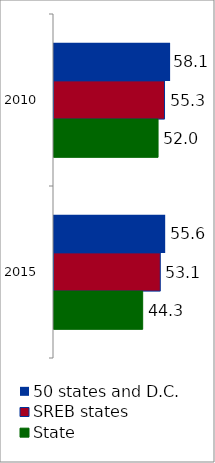
| Category | 50 states and D.C. | SREB states | State |
|---|---|---|---|
| 2010.0 | 58.056 | 55.262 | 52.03 |
| 2015.0 | 55.594 | 53.14 | 44.342 |